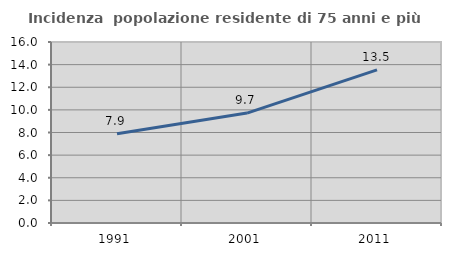
| Category | Incidenza  popolazione residente di 75 anni e più |
|---|---|
| 1991.0 | 7.881 |
| 2001.0 | 9.717 |
| 2011.0 | 13.538 |